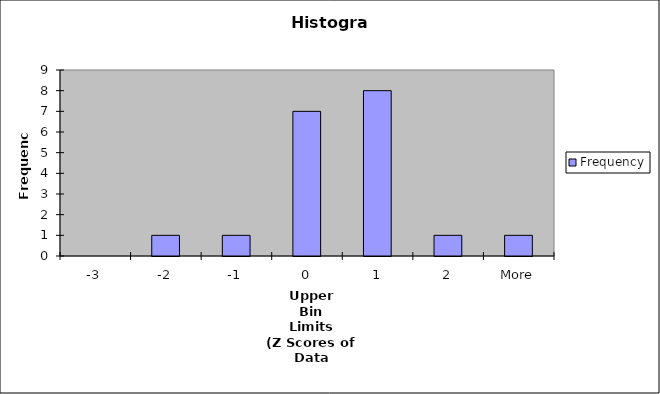
| Category | Frequency |
|---|---|
| -3 | 0 |
| -2 | 1 |
| -1 | 1 |
| 0 | 7 |
| 1 | 8 |
| 2 | 1 |
| More | 1 |